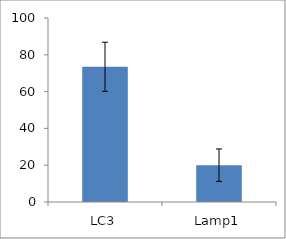
| Category | Series 0 |
|---|---|
| LC3 | 73.5 |
| Lamp1 | 20 |